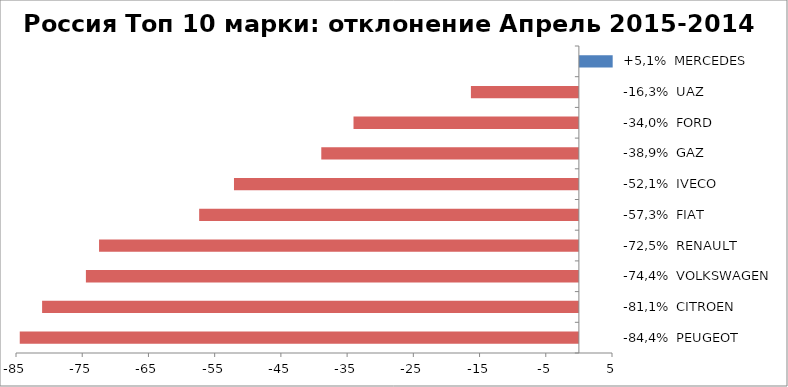
| Category | Россия Топ 10 марки: отклонение Апрель 2015-2014 |
|---|---|
| -84,4%  PEUGEOT | -84.433 |
| -81,1%  CITROEN | -81.058 |
| -74,4%  VOLKSWAGEN | -74.444 |
| -72,5%  RENAULT | -72.458 |
| -57,3%  FIAT | -57.34 |
| -52,1%  IVECO | -52.083 |
| -38,9%  GAZ | -38.899 |
| -34,0%  FORD | -34.035 |
| -16,3%  UAZ | -16.306 |
| +5,1%  MERCEDES | 5.103 |